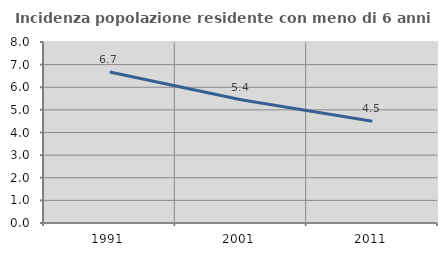
| Category | Incidenza popolazione residente con meno di 6 anni |
|---|---|
| 1991.0 | 6.671 |
| 2001.0 | 5.446 |
| 2011.0 | 4.494 |